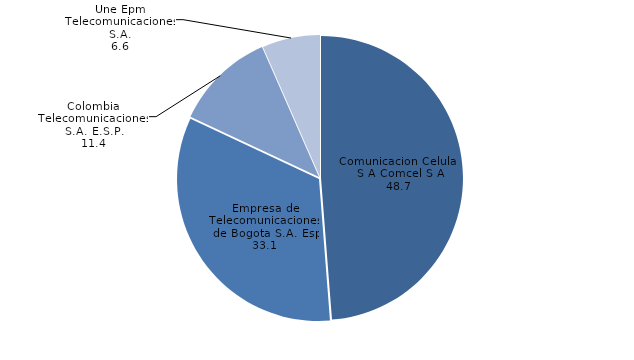
| Category | Series 0 |
|---|---|
| Comunicacion Celular S A Comcel S A | 48.667 |
| Empresa de Telecomunicaciones de Bogota S.A. Esp | 33.134 |
| Colombia Telecomunicaciones S.A. E.S.P. | 11.436 |
| Une Epm Telecomunicaciones S.A. | 6.558 |